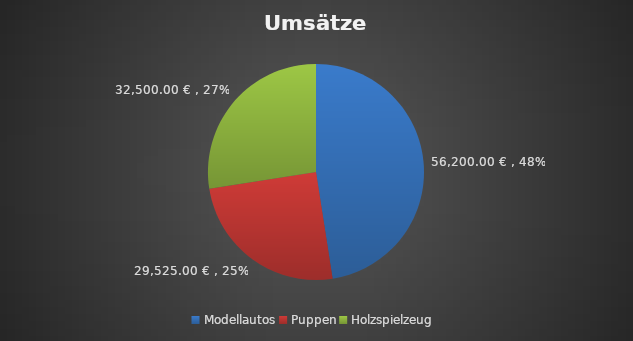
| Category | Verkaufszahlen |
|---|---|
| Modellautos | 56200 |
| Puppen | 29525 |
| Holzspielzeug | 32500 |